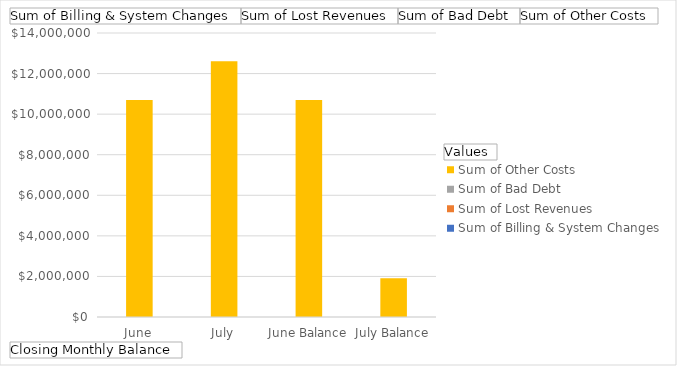
| Category | Sum of Billing & System Changes | Sum of Lost Revenues | Sum of Bad Debt | Sum of Other Costs |
|---|---|---|---|---|
| June | 0 | 0 | 0 | 10697865.51 |
| July | 0 | 0 | 0 | 12602586.11 |
| June Balance | 0 | 0 | 0 | 10697865.51 |
| July Balance | 0 | 0 | 0 | 1904720.6 |